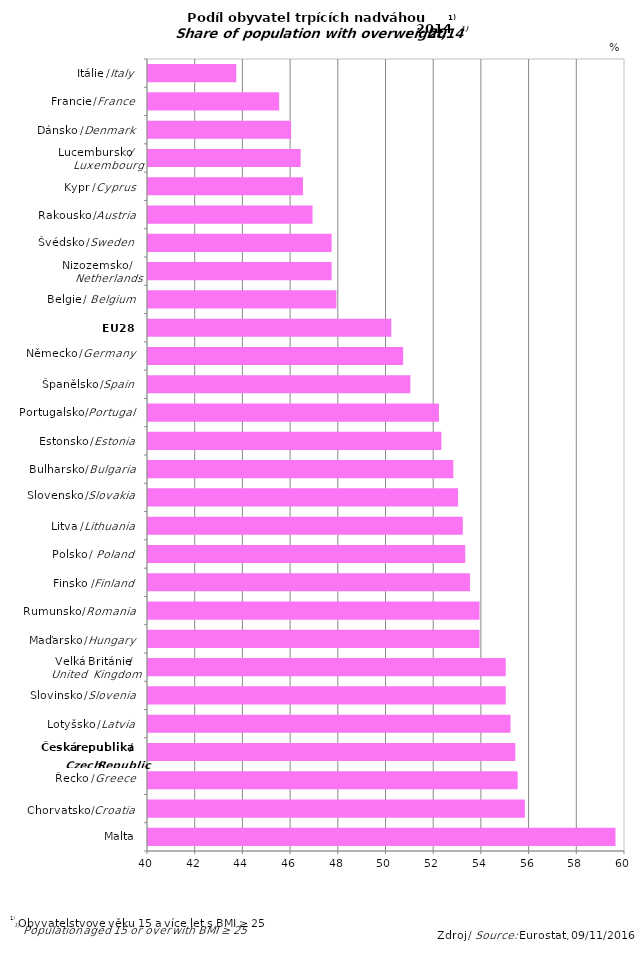
| Category | Series 0 |
|---|---|
|  | 59.6 |
|  | 55.8 |
|  | 55.5 |
|  | 55.4 |
|  | 55.2 |
|  | 55 |
|  | 55 |
|  | 53.9 |
|  | 53.9 |
|  | 53.5 |
|  | 53.3 |
|  | 53.2 |
|  | 53 |
|  | 52.8 |
|  | 52.3 |
|  | 52.2 |
|  | 51 |
|  | 50.7 |
|  | 50.2 |
|  | 47.9 |
|  | 47.7 |
|  | 47.7 |
|  | 46.9 |
|  | 46.5 |
|  | 46.4 |
|  | 46 |
|  | 45.5 |
|  | 43.7 |